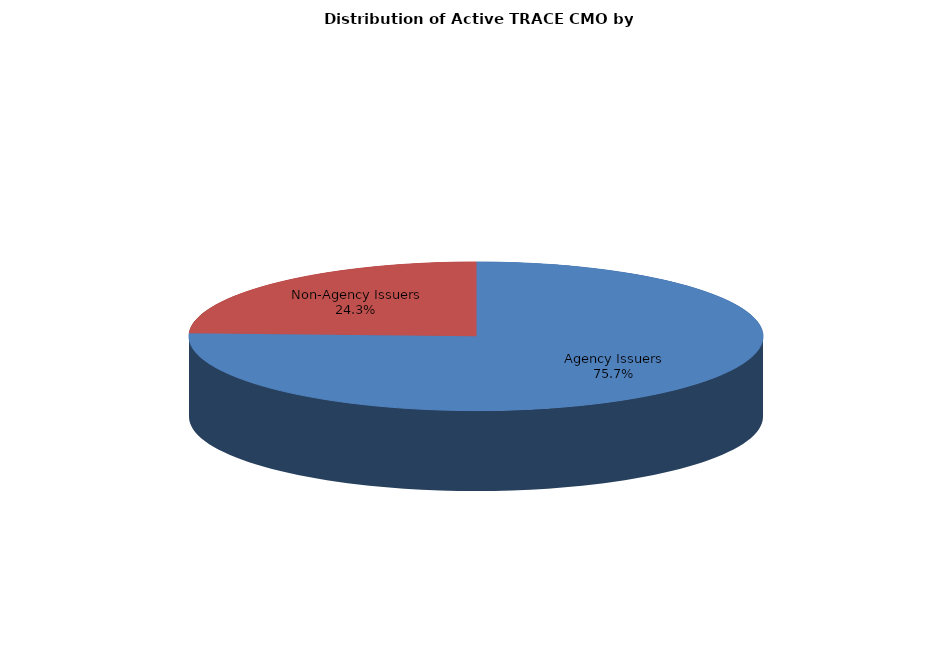
| Category | Series 0 |
|---|---|
| Agency Issuers | 220672 |
| Non-Agency Issuers | 70950 |